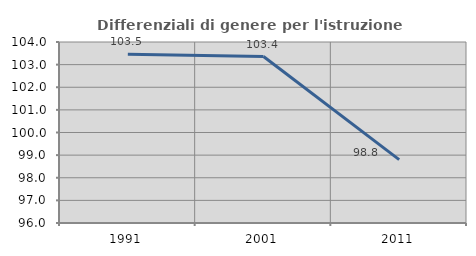
| Category | Differenziali di genere per l'istruzione superiore |
|---|---|
| 1991.0 | 103.456 |
| 2001.0 | 103.359 |
| 2011.0 | 98.8 |